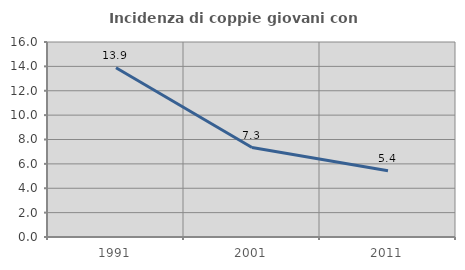
| Category | Incidenza di coppie giovani con figli |
|---|---|
| 1991.0 | 13.883 |
| 2001.0 | 7.342 |
| 2011.0 | 5.429 |